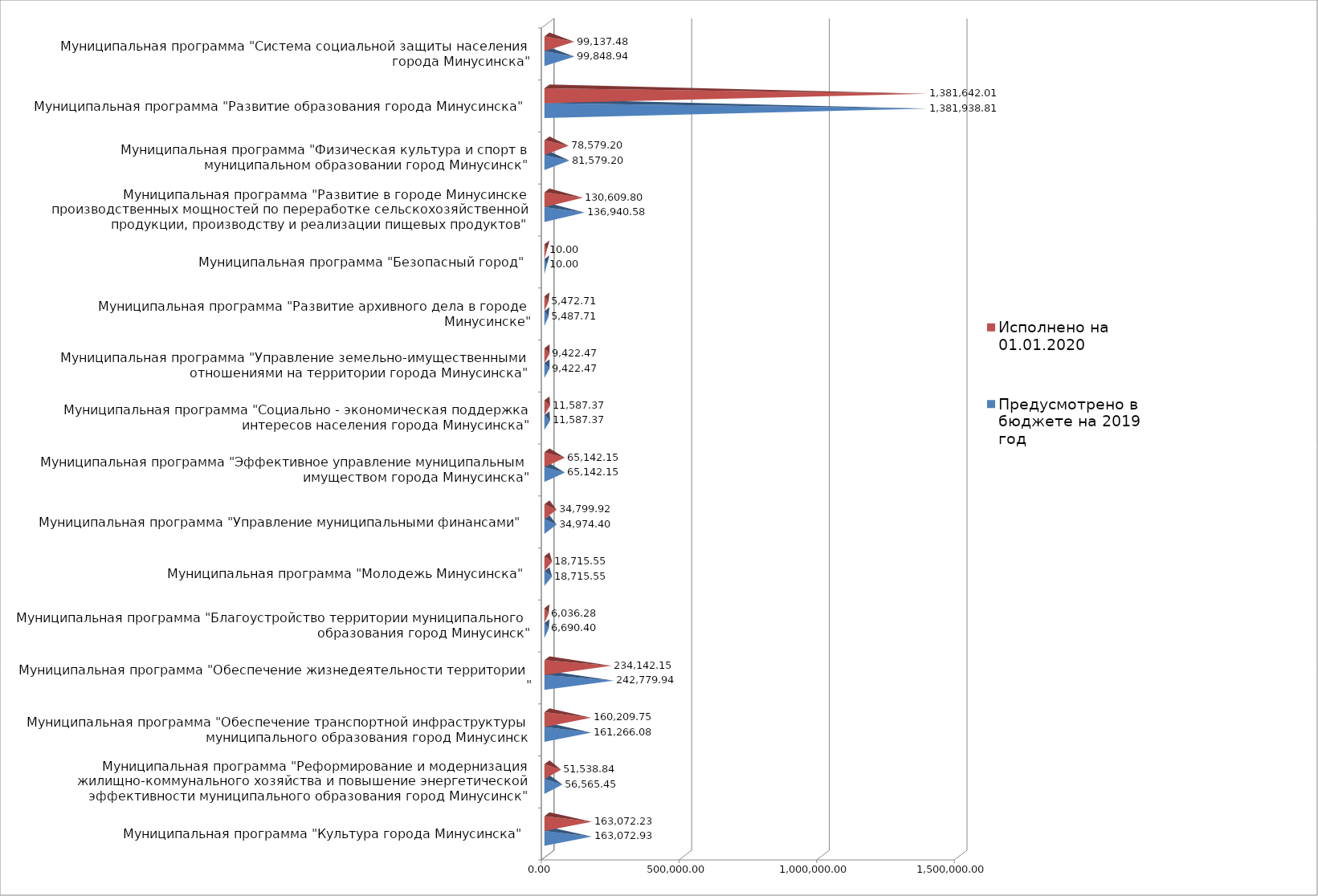
| Category | Предусмотрено в бюджете на 2019 год | Исполнено на 01.01.2020 |
|---|---|---|
| Муниципальная программа "Культура города Минусинска" | 163072.933 | 163072.229 |
| Муниципальная программа "Реформирование и модернизация жилищно-коммунального хозяйства и повышение энергетической эффективности муниципального образования город Минусинск" | 56565.454 | 51538.839 |
| Муниципальная программа "Обеспечение транспортной инфраструктуры муниципального образования город Минусинск | 161266.076 | 160209.746 |
| Муниципальная программа "Обеспечение жизнедеятельности территории " | 242779.936 | 234142.147 |
| Муниципальная программа "Благоустройство территории муниципального образования город Минусинск" | 6690.4 | 6036.277 |
| Муниципальная программа "Молодежь Минусинска" | 18715.554 | 18715.554 |
| Муниципальная программа "Управление муниципальными финансами" | 34974.398 | 34799.925 |
| Муниципальная программа "Эффективное управление муниципальным имуществом города Минусинска" | 65142.153 | 65142.146 |
| Муниципальная программа "Социально - экономическая поддержка интересов населения города Минусинска" | 11587.371 | 11587.371 |
| Муниципальная программа "Управление земельно-имущественными отношениями на территории города Минусинска" | 9422.47 | 9422.47 |
| Муниципальная программа "Развитие архивного дела в городе Минусинске" | 5487.711 | 5472.711 |
| Муниципальная программа "Безопасный город" | 9.995 | 9.995 |
| Муниципальная программа "Развитие в городе Минусинске производственных мощностей по переработке сельскохозяйственной продукции, производству и реализации пищевых продуктов" | 136940.579 | 130609.796 |
| Муниципальная программа "Физическая культура и спорт в муниципальном образовании город Минусинск" | 81579.202 | 78579.202 |
| Муниципальная программа "Развитие образования города Минусинска" | 1381938.806 | 1381642.014 |
| Муниципальная программа "Система социальной защиты населения города Минусинска" | 99848.94 | 99137.475 |